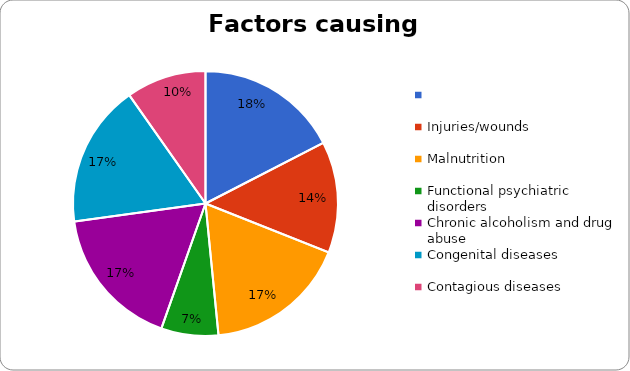
| Category | Series 0 |
|---|---|
|  | 100 |
| Injuries/wounds | 78 |
| Malnutrition | 100 |
| Functional psychiatric disorders | 40 |
| Chronic alcoholism and drug abuse | 100 |
| Congenital diseases | 100 |
| Contagious diseases | 56 |